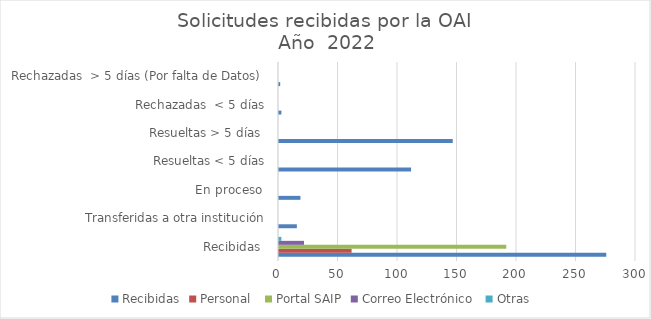
| Category | Recibidas | Personal  | Portal SAIP | Correo Electrónico  | Otras  |
|---|---|---|---|---|---|
| Recibidas  | 275 | 61 | 191 | 21 | 2 |
|  Transferidas a otra institución | 15 | 0 | 0 | 0 | 0 |
| En proceso  | 18 | 0 | 0 | 0 | 0 |
| Resueltas < 5 días | 111 | 0 | 0 | 0 | 0 |
| Resueltas > 5 días  | 146 | 0 | 0 | 0 | 0 |
| Rechazadas  < 5 días | 2 | 0 | 0 | 0 | 0 |
| Rechazadas  > 5 días (Por falta de Datos)  | 1 | 0 | 0 | 0 | 0 |